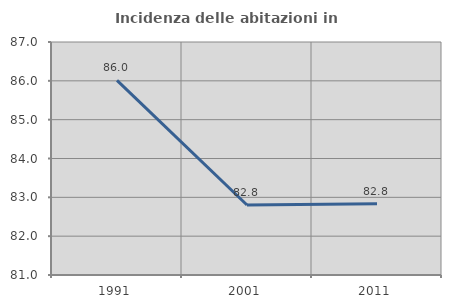
| Category | Incidenza delle abitazioni in proprietà  |
|---|---|
| 1991.0 | 86.012 |
| 2001.0 | 82.803 |
| 2011.0 | 82.836 |